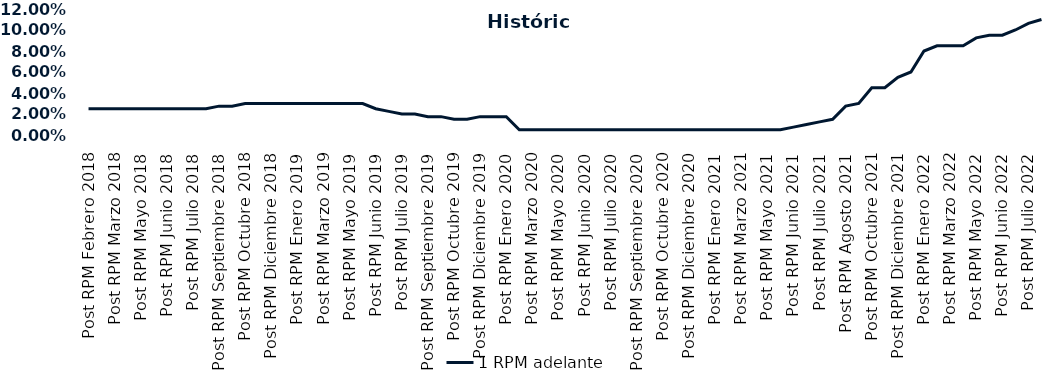
| Category | 1 RPM adelante |
|---|---|
| Post RPM Febrero 2018 | 0.025 |
| Pre RPM Marzo 2018 | 0.025 |
| Post RPM Marzo 2018 | 0.025 |
| Pre RPM Mayo 2018 | 0.025 |
| Post RPM Mayo 2018 | 0.025 |
| Pre RPM Junio 2018 | 0.025 |
| Post RPM Junio 2018 | 0.025 |
| Pre RPM Julio 2018 | 0.025 |
| Post RPM Julio 2018 | 0.025 |
| Pre RPM Septiembre 2018 | 0.025 |
| Post RPM Septiembre 2018 | 0.028 |
| Pre RPM Octubre 2018 | 0.028 |
| Post RPM Octubre 2018 | 0.03 |
| Pre RPM Diciembre 2018 | 0.03 |
| Post RPM Diciembre 2018 | 0.03 |
| Pre RPM Enero 2019 | 0.03 |
| Post RPM Enero 2019 | 0.03 |
| Pre RPM Marzo 2019 | 0.03 |
| Post RPM Marzo 2019 | 0.03 |
| Pre RPM Mayo 2019 | 0.03 |
| Post RPM Mayo 2019 | 0.03 |
| Pre RPM Junio 2019 | 0.03 |
| Post RPM Junio 2019 | 0.025 |
| Pre RPM Julio 2019 | 0.022 |
| Post RPM Julio 2019 | 0.02 |
| Pre RPM Septiembre 2019 | 0.02 |
| Post RPM Septiembre 2019 | 0.018 |
| Pre RPM Octubre 2019 | 0.018 |
| Post RPM Octubre 2019 | 0.015 |
| Pre RPM Diciembre 2019 | 0.015 |
| Post RPM Diciembre 2019 | 0.018 |
| Pre RPM Enero 2020 | 0.018 |
| Post RPM Enero 2020 | 0.018 |
| Pre RPM Marzo 2020 | 0.005 |
| Post RPM Marzo 2020 | 0.005 |
| Pre RPM Mayo 2020 | 0.005 |
| Post RPM Mayo 2020 | 0.005 |
| Pre RPM Junio 2020 | 0.005 |
| Post RPM Junio 2020 | 0.005 |
| Pre RPM Julio 2020 | 0.005 |
| Post RPM Julio 2020 | 0.005 |
| Pre RPM Septiembre 2020 | 0.005 |
| Post RPM Septiembre 2020 | 0.005 |
| Pre RPM Octubre 2020 | 0.005 |
| Post RPM Octubre 2020 | 0.005 |
| Pre RPM Diciembre 2020 | 0.005 |
| Post RPM Diciembre 2020 | 0.005 |
| Pre RPM Enero 2021 | 0.005 |
| Post RPM Enero 2021 | 0.005 |
| Pre RPM Marzo 2021 | 0.005 |
| Post RPM Marzo 2021 | 0.005 |
| Pre RPM Mayo 2021 | 0.005 |
| Post RPM Mayo 2021 | 0.005 |
| Pre RPM Junio 2021 | 0.005 |
| Post RPM Junio 2021 | 0.008 |
| Pre RPM Julio 2021 | 0.01 |
| Post RPM Julio 2021 | 0.012 |
| Pre RPM Agosto 2021 | 0.015 |
| Post RPM Agosto 2021 | 0.028 |
| Pre RPM Octubre 2021 | 0.03 |
| Post RPM Octubre 2021 | 0.045 |
| Pre RPM Diciembre 2021 | 0.045 |
| Post RPM Diciembre 2021 | 0.055 |
| Pre RPM Enero 2022 | 0.06 |
| Post RPM Enero 2022 | 0.08 |
| Pre RPM Marzo 2022 | 0.085 |
| Post RPM Marzo 2022 | 0.085 |
| Pre RPM Mayo 2022 | 0.085 |
| Post RPM Mayo 2022 | 0.092 |
| Pre RPM Junio 2022 | 0.095 |
| Post RPM Junio 2022 | 0.095 |
| Pre RPM Julio 2022 | 0.1 |
| Post RPM Julio 2022 | 0.106 |
| Pre RPM Septiembre 2022 | 0.11 |